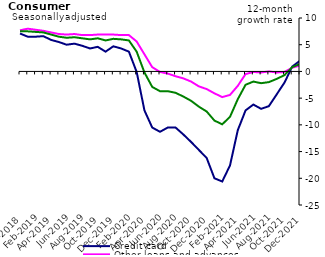
| Category | Credit card | Other loans and advances | Total |
|---|---|---|---|
| Dec-2018 | 7.1 | 7.7 | 7.5 |
| Jan-2019 | 6.5 | 8 | 7.5 |
| Feb-2019 | 6.5 | 7.8 | 7.4 |
| Mar-2019 | 6.6 | 7.6 | 7.3 |
| Apr-2019 | 5.9 | 7.3 | 6.9 |
| May-2019 | 5.5 | 7 | 6.5 |
| Jun-2019 | 5 | 6.9 | 6.3 |
| Jul-2019 | 5.2 | 7 | 6.4 |
| Aug-2019 | 4.8 | 6.8 | 6.2 |
| Sep-2019 | 4.3 | 6.8 | 6 |
| Oct-2019 | 4.6 | 6.9 | 6.2 |
| Nov-2019 | 3.7 | 6.9 | 5.8 |
| Dec-2019 | 4.7 | 6.9 | 6.1 |
| Jan-2020 | 4.3 | 6.8 | 6 |
| Feb-2020 | 3.7 | 6.8 | 5.8 |
| Mar-2020 | -0.1 | 5.6 | 3.7 |
| Apr-2020 | -7.3 | 3.2 | -0.2 |
| May-2020 | -10.5 | 0.8 | -2.9 |
| Jun-2020 | -11.3 | -0.1 | -3.7 |
| Jul-2020 | -10.5 | -0.4 | -3.7 |
| Aug-2020 | -10.5 | -0.9 | -4 |
| Sep-2020 | -11.8 | -1.3 | -4.7 |
| Oct-2020 | -13.2 | -1.9 | -5.5 |
| Nov-2020 | -14.7 | -2.8 | -6.6 |
| Dec-2020 | -16.2 | -3.3 | -7.5 |
| Jan-2021 | -20 | -4.1 | -9.2 |
| Feb-2021 | -20.6 | -4.8 | -9.9 |
| Mar-2021 | -17.6 | -4.4 | -8.5 |
| Apr-2021 | -11 | -2.7 | -5.2 |
| May-2021 | -7.3 | -0.5 | -2.5 |
| Jun-2021 | -6.2 | -0.1 | -1.9 |
| Jul-2021 | -7 | -0.2 | -2.2 |
| Aug-2021 | -6.5 | 0 | -2 |
| Sep-2021 | -4.3 | -0.2 | -1.4 |
| Oct-2021 | -2.1 | -0.1 | -0.7 |
| Nov-2021 | 0.9 | 0.7 | 0.8 |
| Dec-2021 | 2 | 1.1 | 1.4 |